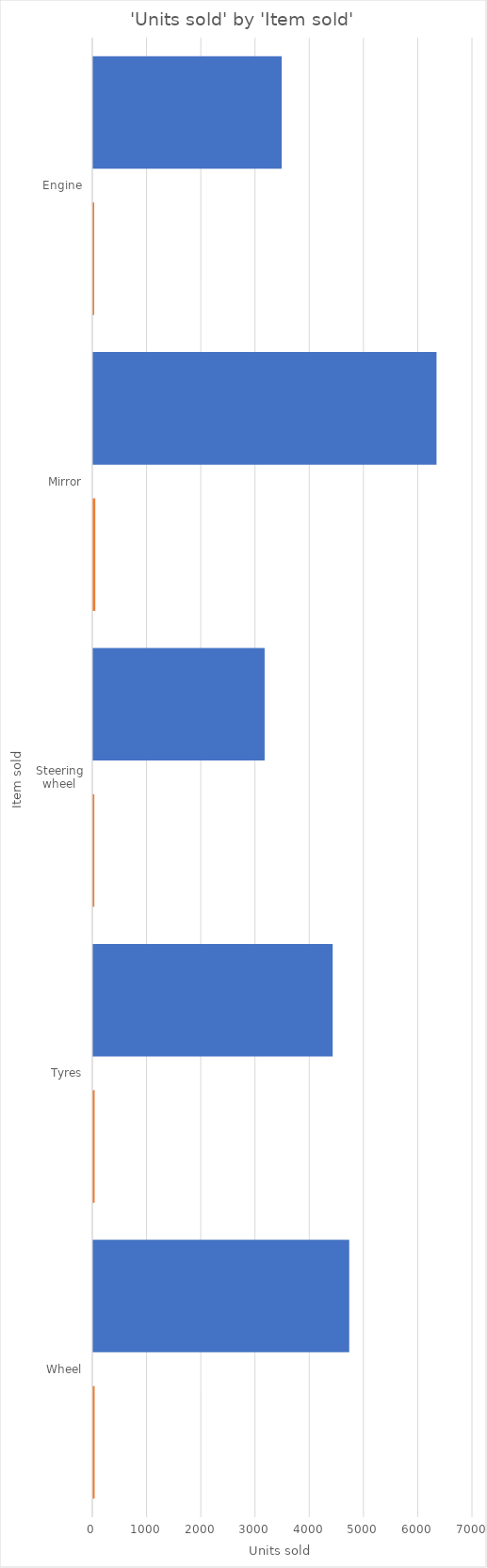
| Category | Sum of Income | Count of Employee |
|---|---|---|
| Engine | 3475 | 18 |
| Mirror | 6330 | 38 |
| Steering wheel | 3160 | 20 |
| Tyres | 4415 | 26 |
| Wheel | 4720 | 26 |